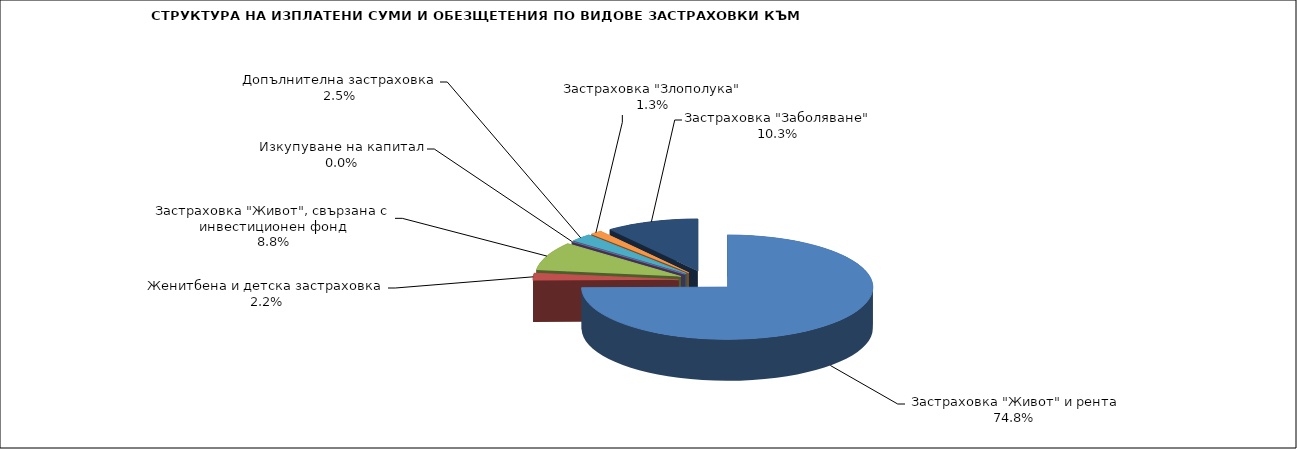
| Category |  Застраховка "Живот" и рента |
|---|---|
|  Застраховка "Живот" и рента | 139662312.612 |
| Женитбена и детска застраховка | 4077483.505 |
| Застраховка "Живот", свързана с инвестиционен фонд | 16514600.463 |
| Изкупуване на капитал | 0 |
| Допълнителна застраховка | 4625574.117 |
| Застраховка "Злополука" | 2502697.035 |
| Застраховка "Заболяване" | 19315315.338 |